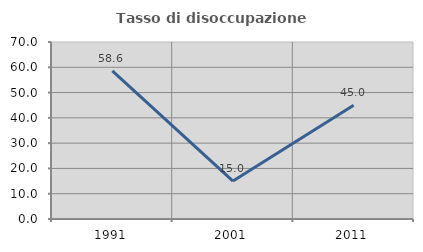
| Category | Tasso di disoccupazione giovanile  |
|---|---|
| 1991.0 | 58.621 |
| 2001.0 | 15 |
| 2011.0 | 45 |